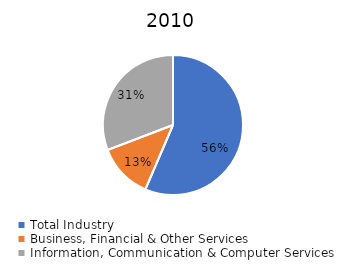
| Category | Series 0 |
|---|---|
| Total Industry | 0.565 |
| Business, Financial & Other Services | 0.127 |
| Information, Communication & Computer Services | 0.308 |